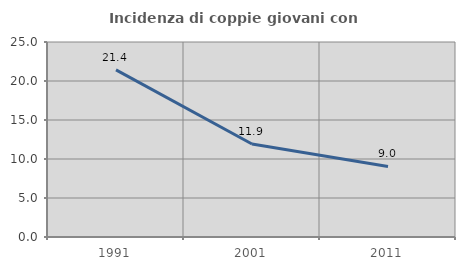
| Category | Incidenza di coppie giovani con figli |
|---|---|
| 1991.0 | 21.429 |
| 2001.0 | 11.927 |
| 2011.0 | 9.045 |